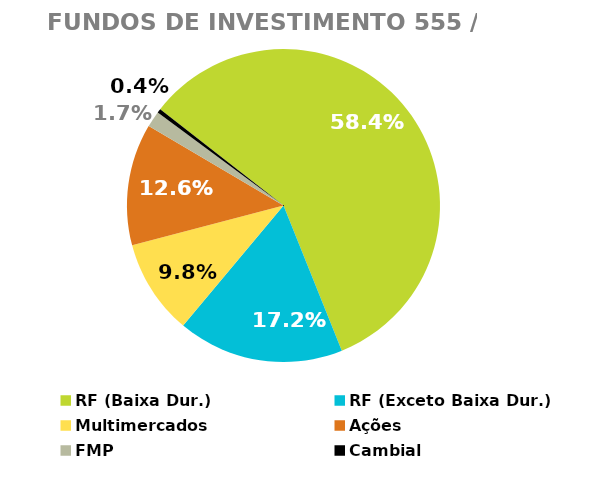
| Category | Fundos de Investimento 555 / FMP |
|---|---|
| RF (Baixa Dur.) | 0.584 |
| RF (Exceto Baixa Dur.) | 0.172 |
| Multimercados | 0.098 |
| Ações | 0.126 |
| FMP | 0.017 |
| Cambial | 0.004 |